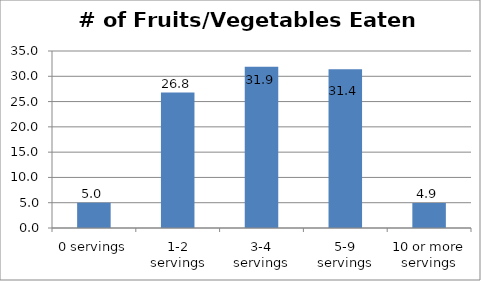
| Category | Series 0 |
|---|---|
| 0 servings | 5.013 |
| 1-2 servings | 26.778 |
| 3-4 servings | 31.895 |
| 5-9 servings | 31.379 |
| 10 or more servings | 4.935 |